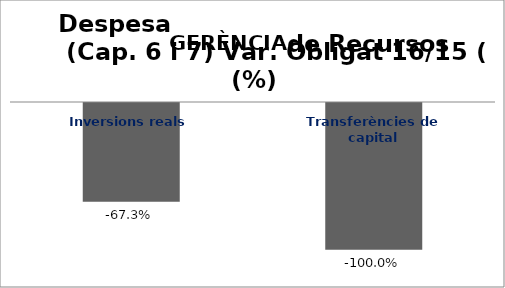
| Category | Series 0 |
|---|---|
| Inversions reals | -0.673 |
| Transferències de capital | -1 |